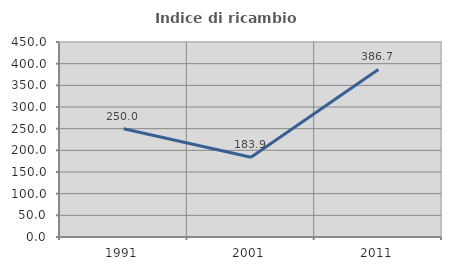
| Category | Indice di ricambio occupazionale  |
|---|---|
| 1991.0 | 250 |
| 2001.0 | 183.871 |
| 2011.0 | 386.667 |